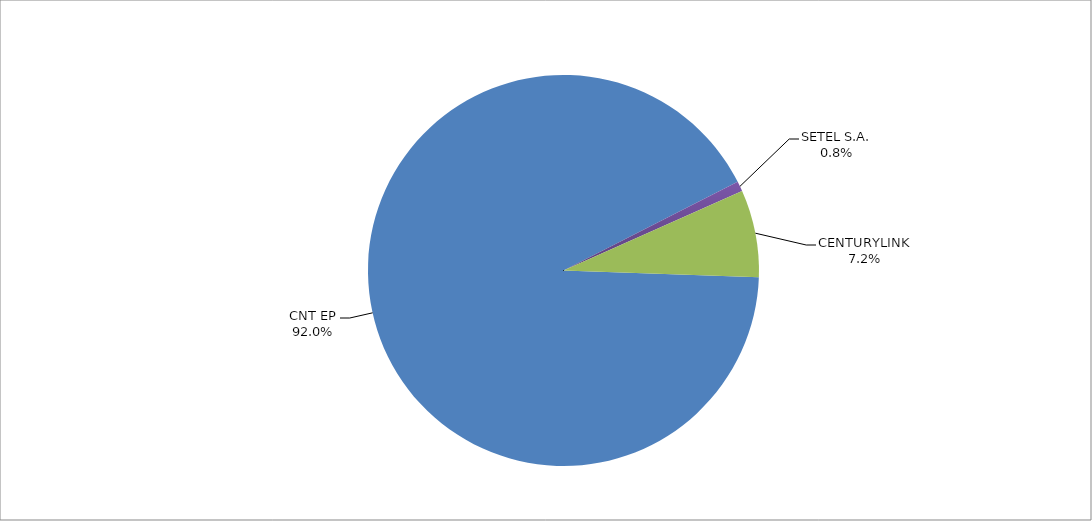
| Category | Series 0 |
|---|---|
| CNT EP | 331 |
| SETEL S.A. | 3 |
| CENTURYLINK | 26 |